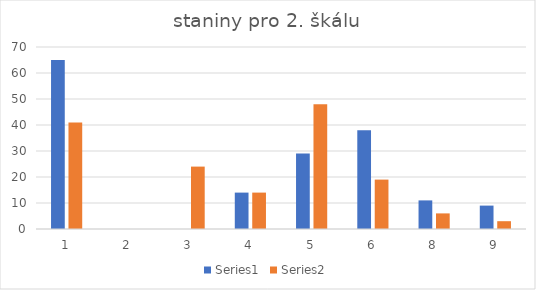
| Category | Series 0 | Series 1 |
|---|---|---|
| 1.0 | 65 | 41 |
| 2.0 | 0 | 0 |
| 3.0 | 0 | 24 |
| 4.0 | 14 | 14 |
| 5.0 | 29 | 48 |
| 6.0 | 38 | 19 |
| 8.0 | 11 | 6 |
| 9.0 | 9 | 3 |